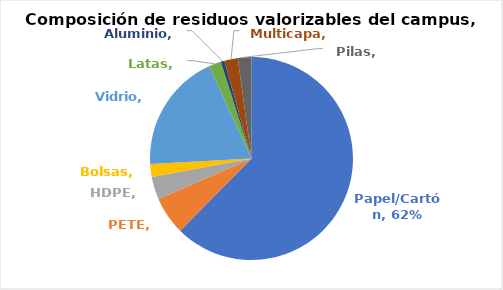
| Category | Series 0 |
|---|---|
| Papel/Cartón | 0.624 |
| PETE | 0.061 |
| HDPE | 0.036 |
| Bolsas | 0.021 |
| Vidrio | 0.19 |
| Latas | 0.02 |
| Aluminio | 0.006 |
| Multicapa | 0.021 |
| Pilas | 0.022 |